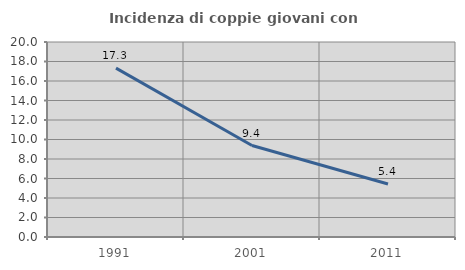
| Category | Incidenza di coppie giovani con figli |
|---|---|
| 1991.0 | 17.325 |
| 2001.0 | 9.383 |
| 2011.0 | 5.435 |